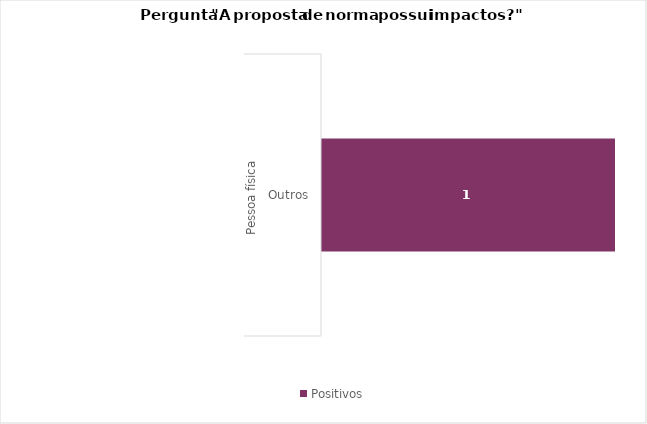
| Category | Positivos |
|---|---|
| 0 | 1 |